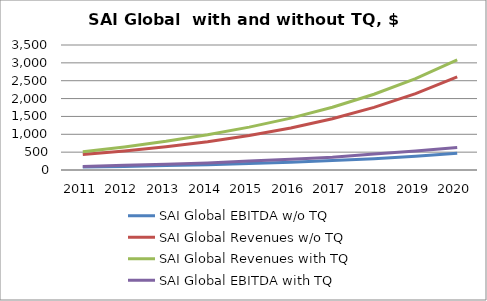
| Category | SAI Global EBITDA w/o TQ | SAI Global Revenues w/o TQ | SAI Global Revenues with TQ | SAI Global EBITDA with TQ |
|---|---|---|---|---|
| 2011.0 | 83.757 | 435.877 | 513.752 | 95.439 |
| 2012.0 | 101.346 | 531.77 | 646.635 | 130.063 |
| 2013.0 | 122.629 | 648.76 | 802.094 | 160.963 |
| 2014.0 | 148.381 | 791.487 | 984.83 | 196.717 |
| 2015.0 | 179.541 | 965.614 | 1200.565 | 250.027 |
| 2016.0 | 217.245 | 1178.049 | 1452.629 | 299.619 |
| 2017.0 | 262.866 | 1437.219 | 1756.895 | 358.769 |
| 2018.0 | 318.068 | 1753.408 | 2120.884 | 446.685 |
| 2019.0 | 384.863 | 2139.157 | 2557.303 | 531.213 |
| 2020.0 | 465.684 | 2609.772 | 3081.627 | 630.833 |